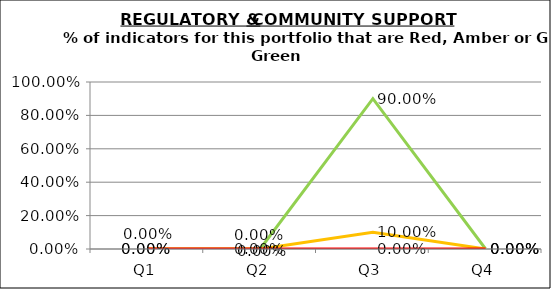
| Category | Green | Amber | Red |
|---|---|---|---|
| Q1 | 0 | 0 | 0 |
| Q2 | 0 | 0 | 0 |
| Q3 | 0.9 | 0.1 | 0 |
| Q4 | 0 | 0 | 0 |